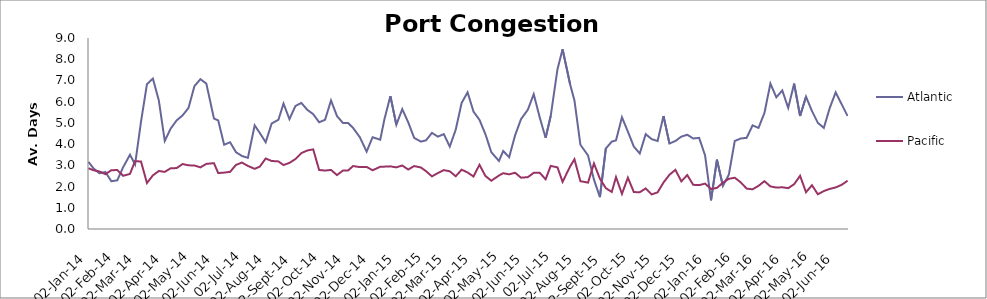
| Category | Atlantic  | Pacific |
|---|---|---|
| 2014-01-02 | 3.167 | 2.863 |
| 2014-01-08 | 2.854 | 2.767 |
| 2014-01-15 | 2.625 | 2.712 |
| 2014-01-22 | 2.688 | 2.582 |
| 2014-01-29 | 2.25 | 2.767 |
| 2014-02-05 | 2.292 | 2.781 |
| 2014-02-12 | 2.917 | 2.507 |
| 2014-02-20 | 3.5 | 2.596 |
| 2014-02-26 | 3.042 | 3.199 |
| 2014-03-05 | 5.059 | 3.178 |
| 2014-03-12 | 6.824 | 2.164 |
| 2014-03-19 | 7.088 | 2.527 |
| 2014-03-26 | 6.059 | 2.733 |
| 2014-04-02 | 4.147 | 2.692 |
| 2014-04-09 | 4.735 | 2.863 |
| 2014-04-16 | 5.118 | 2.87 |
| 2014-04-23 | 5.353 | 3.062 |
| 2014-04-30 | 5.706 | 3 |
| 2014-05-07 | 6.735 | 2.993 |
| 2014-05-14 | 7.059 | 2.904 |
| 2014-05-21 | 6.853 | 3.068 |
| 2014-05-30 | 5.206 | 3.103 |
| 2014-06-04 | 5.118 | 2.637 |
| 2014-06-11 | 3.971 | 2.658 |
| 2014-06-18 | 4.088 | 2.692 |
| 2014-06-25 | 3.618 | 3.021 |
| 2014-07-02 | 3.441 | 3.13 |
| 2014-07-09 | 3.353 | 2.973 |
| 2014-07-17 | 4.882 | 2.836 |
| 2014-07-23 | 4.529 | 2.938 |
| 2014-07-30 | 4.088 | 3.322 |
| 2014-08-06 | 4.971 | 3.205 |
| 2014-08-14 | 5.147 | 3.185 |
| 2014-08-20 | 5.912 | 3.014 |
| 2014-08-27 | 5.176 | 3.116 |
| 2014-09-03 | 5.794 | 3.295 |
| 2014-09-10 | 5.941 | 3.575 |
| 2014-09-17 | 5.618 | 3.699 |
| 2014-09-24 | 5.412 | 3.753 |
| 2014-10-01 | 5.029 | 2.781 |
| 2014-10-08 | 5.147 | 2.753 |
| 2014-10-15 | 6.059 | 2.785 |
| 2014-10-22 | 5.324 | 2.541 |
| 2014-10-29 | 5 | 2.753 |
| 2014-11-04 | 5 | 2.753 |
| 2014-11-10 | 4.765 | 2.966 |
| 2014-11-18 | 4.324 | 2.918 |
| 2014-11-26 | 3.647 | 2.925 |
| 2014-12-03 | 4.324 | 2.767 |
| 2014-12-12 | 4.206 | 2.932 |
| 2014-12-17 | 5.176 | 2.938 |
| 2014-12-24 | 6.265 | 2.952 |
| 2014-12-31 | 4.912 | 2.904 |
| 2015-01-07 | 5.647 | 2.993 |
| 2015-01-14 | 5.029 | 2.801 |
| 2015-01-21 | 4.294 | 2.966 |
| 2015-01-29 | 4.118 | 2.897 |
| 2015-02-04 | 4.176 | 2.726 |
| 2015-02-11 | 4.529 | 2.479 |
| 2015-02-18 | 4.353 | 2.637 |
| 2015-02-25 | 4.471 | 2.774 |
| 2015-03-04 | 3.882 | 2.719 |
| 2015-03-11 | 4.676 | 2.486 |
| 2015-03-18 | 5.941 | 2.795 |
| 2015-03-25 | 6.441 | 2.664 |
| 2015-04-01 | 5.529 | 2.473 |
| 2015-04-08 | 5.147 | 3.027 |
| 2015-04-15 | 4.471 | 2.5 |
| 2015-04-22 | 3.618 | 2.274 |
| 2015-05-01 | 3.206 | 2.521 |
| 2015-05-06 | 3.676 | 2.63 |
| 2015-05-13 | 3.382 | 2.575 |
| 2015-05-20 | 4.412 | 2.651 |
| 2015-05-27 | 5.176 | 2.418 |
| 2015-06-04 | 5.618 | 2.442 |
| 2015-06-11 | 6.353 | 2.645 |
| 2015-06-18 | 5.265 | 2.651 |
| 2015-06-25 | 4.294 | 2.342 |
| 2015-07-01 | 5.324 | 2.973 |
| 2015-07-09 | 7.529 | 2.904 |
| 2015-07-15 | 8.471 | 2.223 |
| 2015-07-24 | 6.794 | 2.952 |
| 2015-07-29 | 6.059 | 3.288 |
| 2015-08-05 | 3.971 | 2.253 |
| 2015-08-14 | 3.471 | 2.185 |
| 2015-08-21 | 2.324 | 3.089 |
| 2015-08-28 | 1.5 | 2.37 |
| 2015-09-04 | 3.794 | 1.925 |
| 2015-09-11 | 4.118 | 1.747 |
| 2015-09-16 | 4.176 | 2.445 |
| 2015-09-23 | 5.265 | 1.658 |
| 2015-09-30 | 4.588 | 2.418 |
| 2015-10-07 | 3.882 | 1.74 |
| 2015-10-14 | 3.559 | 1.733 |
| 2015-10-21 | 4.471 | 1.911 |
| 2015-10-28 | 4.235 | 1.63 |
| 2015-11-04 | 4.147 | 1.726 |
| 2015-11-11 | 5.324 | 2.192 |
| 2015-11-18 | 4.029 | 2.555 |
| 2015-11-25 | 4.147 | 2.788 |
| 2015-12-02 | 4.353 | 2.247 |
| 2015-12-09 | 4.441 | 2.541 |
| 2015-12-16 | 4.265 | 2.082 |
| 2015-12-23 | 4.294 | 2.068 |
| 2015-12-30 | 3.471 | 2.137 |
| 2016-01-06 | 1.353 | 1.884 |
| 2016-01-13 | 3.265 | 1.938 |
| 2016-01-20 | 2.029 | 2.185 |
| 2016-01-27 | 2.559 | 2.363 |
| 2016-02-03 | 4.147 | 2.418 |
| 2016-02-10 | 4.265 | 2.199 |
| 2016-02-17 | 4.294 | 1.904 |
| 2016-02-24 | 4.882 | 1.87 |
| 2016-03-02 | 4.765 | 2.034 |
| 2016-03-09 | 5.471 | 2.253 |
| 2016-03-16 | 6.853 | 2.007 |
| 2016-03-23 | 6.206 | 1.952 |
| 2016-03-30 | 6.529 | 1.966 |
| 2016-04-06 | 5.706 | 1.925 |
| 2016-04-13 | 6.853 | 2.11 |
| 2016-04-20 | 5.324 | 2.507 |
| 2016-04-27 | 6.235 | 1.733 |
| 2016-05-04 | 5.559 | 2.062 |
| 2016-05-11 | 5 | 1.637 |
| 2016-05-18 | 4.765 | 1.788 |
| 2016-05-25 | 5.706 | 1.89 |
| 2016-06-01 | 6.441 | 1.959 |
| 2016-06-08 | 5.882 | 2.082 |
| 2016-06-15 | 5.324 | 2.274 |